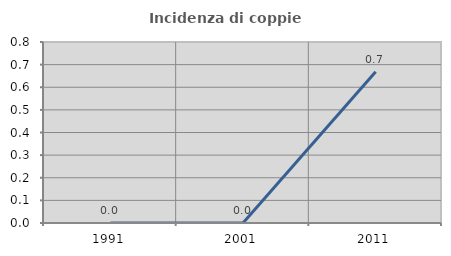
| Category | Incidenza di coppie miste |
|---|---|
| 1991.0 | 0 |
| 2001.0 | 0 |
| 2011.0 | 0.668 |